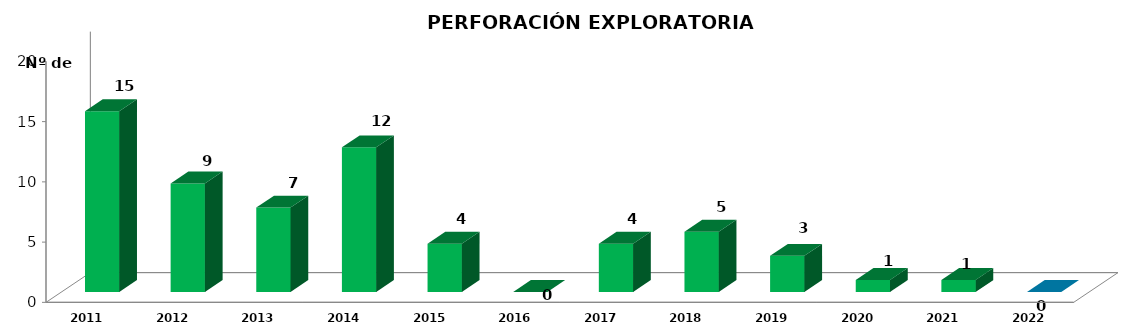
| Category | Series 0 |
|---|---|
| 2011.0 | 15 |
| 2012.0 | 9 |
| 2013.0 | 7 |
| 2014.0 | 12 |
| 2015.0 | 4 |
| 2016.0 | 0 |
| 2017.0 | 4 |
| 2018.0 | 5 |
| 2019.0 | 3 |
| 2020.0 | 1 |
| 2021.0 | 1 |
| 2022.0 | 0 |